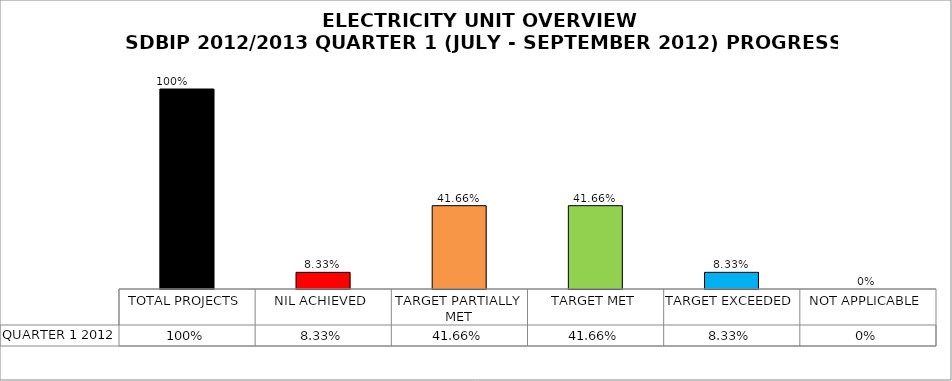
| Category | QUARTER 1 2012 |
|---|---|
| TOTAL PROJECTS | 1 |
| NIL ACHIEVED | 0.083 |
| TARGET PARTIALLY MET | 0.417 |
| TARGET MET | 0.417 |
| TARGET EXCEEDED | 0.083 |
| NOT APPLICABLE | 0 |